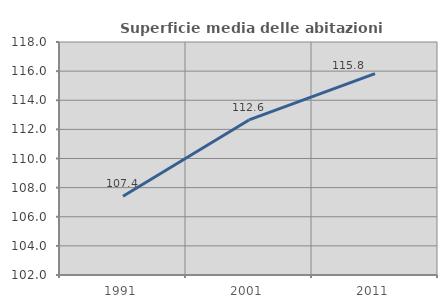
| Category | Superficie media delle abitazioni occupate |
|---|---|
| 1991.0 | 107.41 |
| 2001.0 | 112.647 |
| 2011.0 | 115.83 |